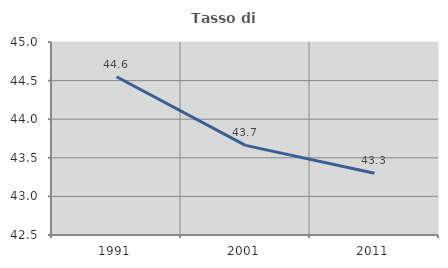
| Category | Tasso di occupazione   |
|---|---|
| 1991.0 | 44.55 |
| 2001.0 | 43.661 |
| 2011.0 | 43.301 |